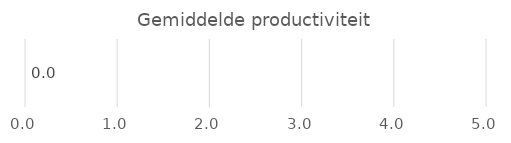
| Category | Series 0 |
|---|---|
| Productiviteit | 0 |